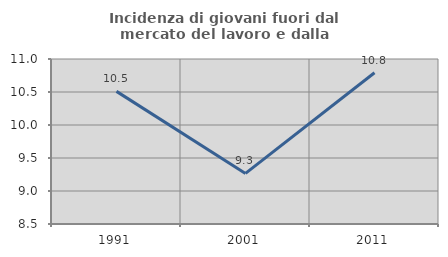
| Category | Incidenza di giovani fuori dal mercato del lavoro e dalla formazione  |
|---|---|
| 1991.0 | 10.51 |
| 2001.0 | 9.266 |
| 2011.0 | 10.791 |